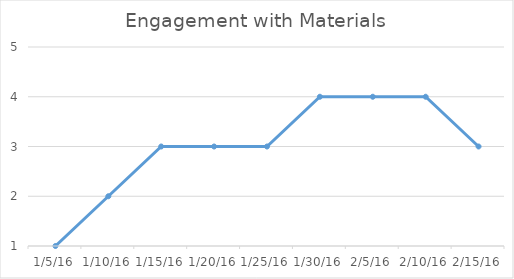
| Category | Series 0 |
|---|---|
| 1/5/16 | 1 |
| 1/10/16 | 2 |
| 1/15/16 | 3 |
| 1/20/16 | 3 |
| 1/25/16 | 3 |
| 1/30/16 | 4 |
| 2/5/16 | 4 |
| 2/10/16 | 4 |
| 2/15/16 | 3 |